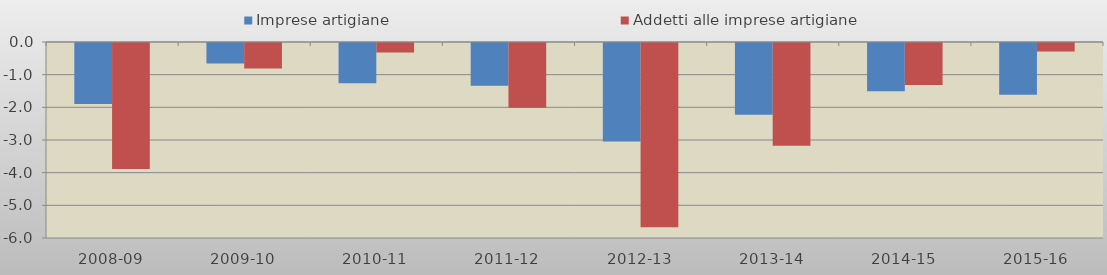
| Category | Imprese artigiane | Addetti alle imprese artigiane |
|---|---|---|
| 2008-09 | -1.866 | -3.856 |
| 2009-10 | -0.631 | -0.782 |
| 2010-11 | -1.235 | -0.293 |
| 2011-12 | -1.312 | -1.979 |
| 2012-13 | -3.019 | -5.637 |
| 2013-14 | -2.196 | -3.144 |
| 2014-15 | -1.476 | -1.288 |
| 2015-16 | -1.582 | -0.264 |